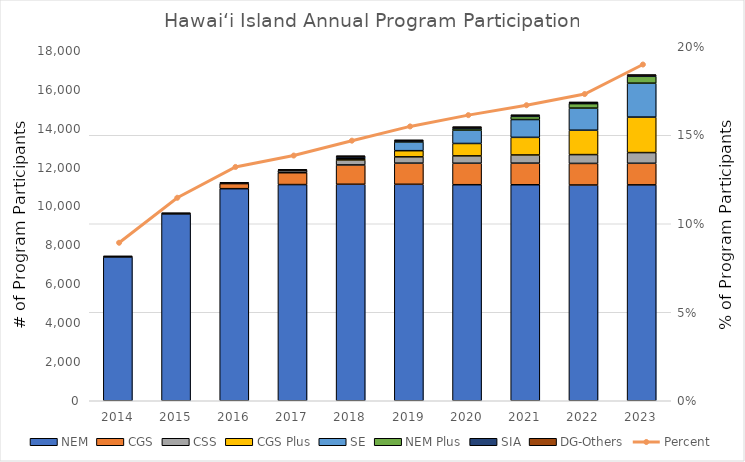
| Category | NEM | CGS | CSS | CGS Plus | SE | NEM Plus | SIA | DG-Others |
|---|---|---|---|---|---|---|---|---|
| 2014.0 | 7394 | 0 | 0 | 0 | 0 | 0 | 25 | 20 |
| 2015.0 | 9605 | 0 | 0 | 0 | 0 | 0 | 33 | 20 |
| 2016.0 | 10903 | 261 | 0 | 0 | 0 | 0 | 37 | 20 |
| 2017.0 | 11114 | 609 | 104 | 0 | 0 | 0 | 42 | 21 |
| 2018.0 | 11130 | 993 | 258 | 61 | 82 | 0 | 44 | 21 |
| 2019.0 | 11129 | 1087 | 324 | 317 | 451 | 28 | 48 | 21 |
| 2020.0 | 11107 | 1104 | 379 | 637 | 687 | 96 | 52 | 21 |
| 2021.0 | 11105 | 1111 | 421 | 905 | 916 | 161 | 55 | 21 |
| 2022.0 | 11093 | 1109 | 453 | 1254 | 1137 | 230 | 57 | 21 |
| 2023.0 | 11100 | 1109 | 550 | 1825 | 1744 | 353 | 59 | 21 |